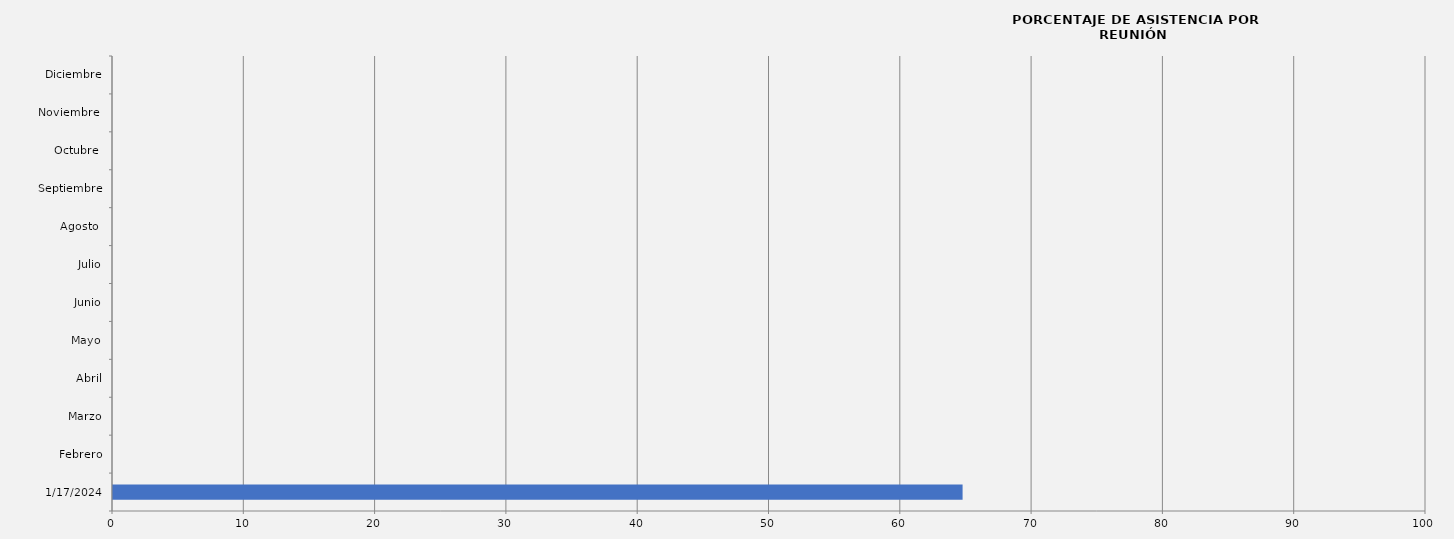
| Category | 17/01/2024 |
|---|---|
| 17/01/2024 | 64.706 |
| Febrero | 0 |
| Marzo | 0 |
| Abril | 0 |
| Mayo | 0 |
| Junio | 0 |
| Julio | 0 |
| Agosto  | 0 |
| Septiembre | 0 |
| Octubre  | 0 |
| Noviembre  | 0 |
| Diciembre | 0 |